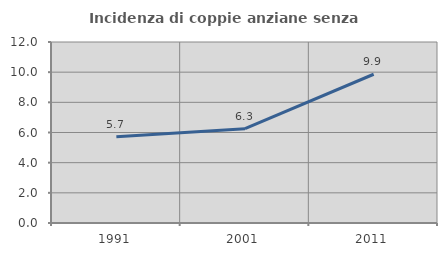
| Category | Incidenza di coppie anziane senza figli  |
|---|---|
| 1991.0 | 5.714 |
| 2001.0 | 6.25 |
| 2011.0 | 9.862 |